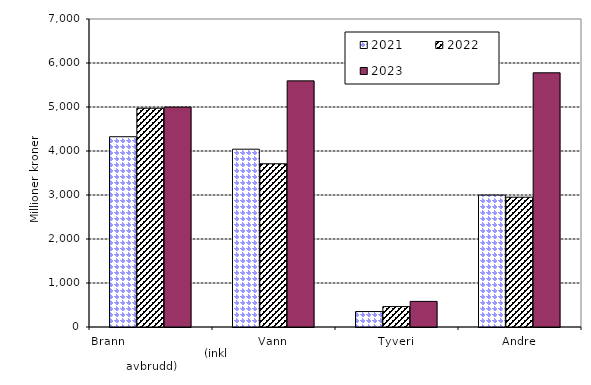
| Category | 2021 | 2022 | 2023 |
|---|---|---|---|
| Brann                                                       (inkl avbrudd) | 4324.255 | 4972.151 | 4998.186 |
| Vann | 4041.101 | 3710.18 | 5593.809 |
| Tyveri | 351.095 | 463.994 | 581.735 |
| Andre | 2997.764 | 2950.034 | 5777.031 |